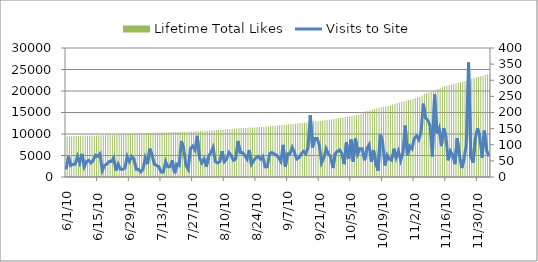
| Category | Lifetime Total Likes |
|---|---|
| 6/1/10 | 9427.625 |
| 6/2/10 | 9456.5 |
| 6/3/10 | 9477.875 |
| 6/4/10 | 9496.125 |
| 6/5/10 | 9514.75 |
| 6/6/10 | 9541.75 |
| 6/7/10 | 9568 |
| 6/8/10 | 9585.125 |
| 6/9/10 | 9599.375 |
| 6/10/10 | 9611.25 |
| 6/11/10 | 9621.5 |
| 6/12/10 | 9633.375 |
| 6/13/10 | 9650.25 |
| 6/14/10 | 9662.375 |
| 6/15/10 | 9679 |
| 6/16/10 | 9705.75 |
| 6/17/10 | 9726.5 |
| 6/18/10 | 9746 |
| 6/19/10 | 9764.5 |
| 6/20/10 | 9786.5 |
| 6/21/10 | 9809.25 |
| 6/22/10 | 9831 |
| 6/23/10 | 9856 |
| 6/24/10 | 9876.625 |
| 6/25/10 | 9893.75 |
| 6/26/10 | 9907.125 |
| 6/27/10 | 9967.625 |
| 6/28/10 | 10004.125 |
| 6/29/10 | 10032.625 |
| 6/30/10 | 10056.75 |
| 7/1/10 | 10073.625 |
| 7/2/10 | 10091.75 |
| 7/3/10 | 10118.75 |
| 7/4/10 | 10198.375 |
| 7/5/10 | 10216.25 |
| 7/6/10 | 10232.5 |
| 7/7/10 | 10246.25 |
| 7/8/10 | 10263.125 |
| 7/9/10 | 10282.375 |
| 7/10/10 | 10299.375 |
| 7/11/10 | 10299.375 |
| 7/12/10 | 10333.625 |
| 7/13/10 | 10350.375 |
| 7/14/10 | 10365.25 |
| 7/15/10 | 10382.125 |
| 7/16/10 | 10400.25 |
| 7/17/10 | 10419.875 |
| 7/18/10 | 10438 |
| 7/19/10 | 10455.625 |
| 7/20/10 | 10476.25 |
| 7/21/10 | 10495.125 |
| 7/22/10 | 10519.125 |
| 7/23/10 | 10542.25 |
| 7/24/10 | 10549.375 |
| 7/25/10 | 10570.375 |
| 7/26/10 | 10588.5 |
| 7/27/10 | 10611.375 |
| 7/28/10 | 10637.125 |
| 7/29/10 | 10684.125 |
| 7/30/10 | 10713.875 |
| 7/31/10 | 10731.25 |
| 8/1/10 | 10751.25 |
| 8/2/10 | 10781.125 |
| 8/3/10 | 10813.375 |
| 8/4/10 | 10846.125 |
| 8/5/10 | 10883.875 |
| 8/6/10 | 10910 |
| 8/7/10 | 10946.875 |
| 8/8/10 | 10982.875 |
| 8/9/10 | 11008.125 |
| 8/10/10 | 11101.375 |
| 8/11/10 | 11146.875 |
| 8/12/10 | 11183.125 |
| 8/13/10 | 11217.625 |
| 8/14/10 | 11251.875 |
| 8/15/10 | 11286.75 |
| 8/16/10 | 11324.375 |
| 8/17/10 | 11354.625 |
| 8/18/10 | 11391.125 |
| 8/19/10 | 11418 |
| 8/20/10 | 11445.625 |
| 8/21/10 | 11468.625 |
| 8/22/10 | 11499.875 |
| 8/23/10 | 11524.25 |
| 8/24/10 | 11563.375 |
| 8/25/10 | 11599.875 |
| 8/26/10 | 11639 |
| 8/27/10 | 11681 |
| 8/28/10 | 11736.375 |
| 8/29/10 | 11794.125 |
| 8/30/10 | 11846.25 |
| 8/31/10 | 11900.75 |
| 9/1/10 | 11950.125 |
| 9/2/10 | 11997.25 |
| 9/3/10 | 12042.75 |
| 9/4/10 | 12085.375 |
| 9/5/10 | 12138.125 |
| 9/6/10 | 12192.375 |
| 9/7/10 | 12246.125 |
| 9/8/10 | 12301.75 |
| 9/9/10 | 12345.25 |
| 9/10/10 | 12402.625 |
| 9/11/10 | 12461.25 |
| 9/12/10 | 12544 |
| 9/13/10 | 12544 |
| 9/14/10 | 12599.25 |
| 9/15/10 | 12655.875 |
| 9/16/10 | 12707.375 |
| 9/17/10 | 12762 |
| 9/18/10 | 12882.125 |
| 9/19/10 | 12937.25 |
| 9/20/10 | 12993.875 |
| 9/21/10 | 13048.125 |
| 9/22/10 | 13124.25 |
| 9/23/10 | 13185.75 |
| 9/24/10 | 13269.625 |
| 9/25/10 | 13319.625 |
| 9/26/10 | 13405.25 |
| 9/27/10 | 13476.625 |
| 9/28/10 | 13554.375 |
| 9/29/10 | 13645.125 |
| 9/30/10 | 13770.625 |
| 10/1/10 | 13861 |
| 10/2/10 | 13946.875 |
| 10/3/10 | 14020.125 |
| 10/4/10 | 14109.75 |
| 10/5/10 | 14194.375 |
| 10/6/10 | 14287.875 |
| 10/7/10 | 14388 |
| 10/8/10 | 14503.875 |
| 10/9/10 | 14629.25 |
| 10/10/10 | 15146.125 |
| 10/11/10 | 15272.75 |
| 10/12/10 | 15421 |
| 10/13/10 | 15539.125 |
| 10/14/10 | 15671.25 |
| 10/15/10 | 15828.5 |
| 10/16/10 | 15974.375 |
| 10/17/10 | 16088.125 |
| 10/18/10 | 16209.5 |
| 10/19/10 | 16316.75 |
| 10/20/10 | 16420.25 |
| 10/21/10 | 16524.5 |
| 10/22/10 | 16678.75 |
| 10/23/10 | 16860.375 |
| 10/24/10 | 16995.375 |
| 10/25/10 | 17130.375 |
| 10/26/10 | 17278.25 |
| 10/27/10 | 17415 |
| 10/28/10 | 17563.125 |
| 10/29/10 | 17705.5 |
| 10/30/10 | 17846.625 |
| 10/31/10 | 17972.75 |
| 11/1/10 | 18135.375 |
| 11/2/10 | 18305.75 |
| 11/3/10 | 18492.125 |
| 11/4/10 | 18656 |
| 11/5/10 | 18925 |
| 11/6/10 | 19281.5 |
| 11/7/10 | 19495.875 |
| 11/8/10 | 19658.75 |
| 11/9/10 | 19821.75 |
| 11/10/10 | 20007.875 |
| 11/11/10 | 20208.75 |
| 11/12/10 | 20455.25 |
| 11/13/10 | 20683.625 |
| 11/14/10 | 20864.375 |
| 11/15/10 | 21088.125 |
| 11/16/10 | 21236 |
| 11/17/10 | 21367.625 |
| 11/18/10 | 21487.5 |
| 11/19/10 | 21634.625 |
| 11/20/10 | 21769.875 |
| 11/21/10 | 21894.5 |
| 11/22/10 | 22022.875 |
| 11/23/10 | 22172.875 |
| 11/24/10 | 22330.125 |
| 11/25/10 | 22509.875 |
| 11/26/10 | 22691.75 |
| 11/27/10 | 22854.5 |
| 11/28/10 | 23020.875 |
| 11/29/10 | 23179.625 |
| 11/30/10 | 23315.75 |
| 12/1/10 | 23440.75 |
| 12/2/10 | 23571.25 |
| 12/3/10 | 23727.25 |
| 12/4/10 | 23897.125 |
| 12/5/10 | 24032.125 |